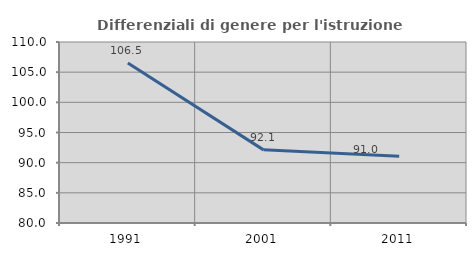
| Category | Differenziali di genere per l'istruzione superiore |
|---|---|
| 1991.0 | 106.529 |
| 2001.0 | 92.121 |
| 2011.0 | 91.05 |